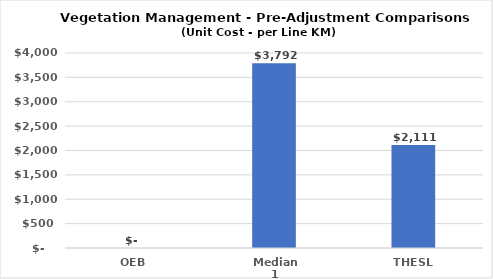
| Category | OEB |
|---|---|
| OEB | 0 |
| Median 1 | 3792.204 |
| THESL | 2111 |